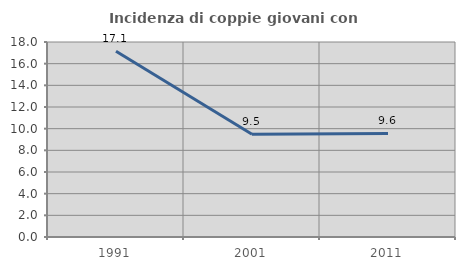
| Category | Incidenza di coppie giovani con figli |
|---|---|
| 1991.0 | 17.143 |
| 2001.0 | 9.483 |
| 2011.0 | 9.559 |